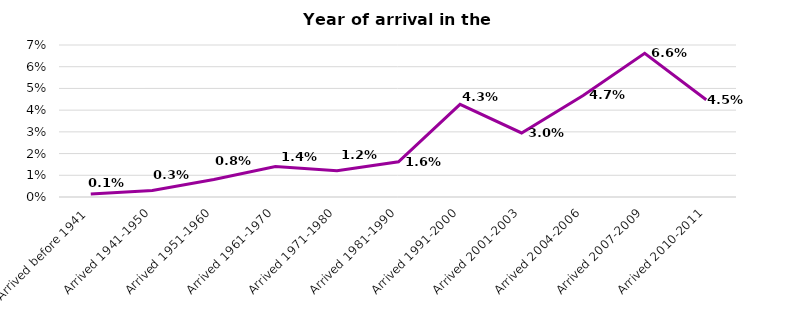
| Category | % |
|---|---|
| Arrived before 1941 | 0.001 |
| Arrived 1941-1950 | 0.003 |
| Arrived 1951-1960 | 0.008 |
| Arrived 1961-1970 | 0.014 |
| Arrived 1971-1980 | 0.012 |
| Arrived 1981-1990 | 0.016 |
| Arrived 1991-2000 | 0.043 |
| Arrived 2001-2003 | 0.03 |
| Arrived 2004-2006 | 0.047 |
| Arrived 2007-2009 | 0.066 |
| Arrived 2010-2011 | 0.045 |